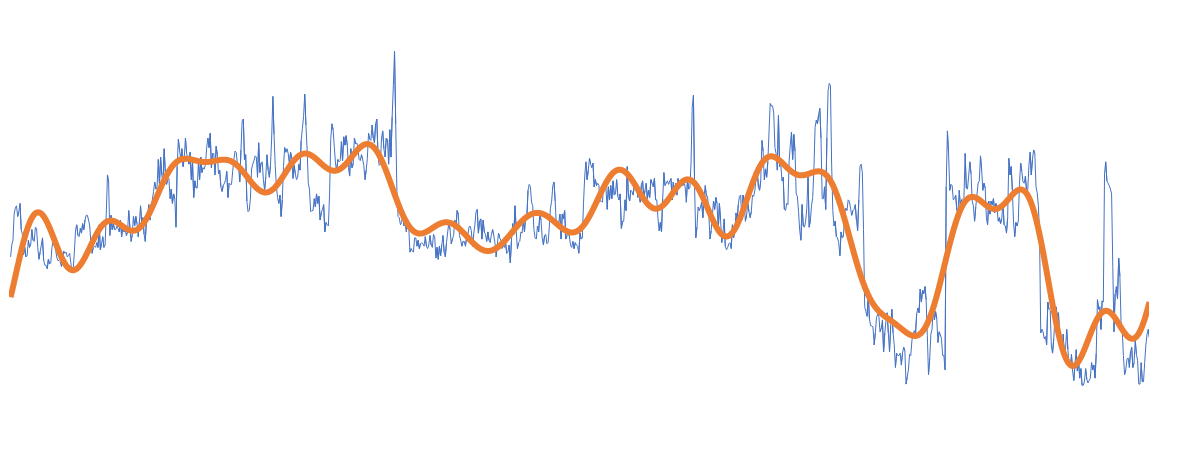
| Category | Original | Filtered |
|---|---|---|
| 0.0 | 149 | 115.1 |
| 1.0 | 159 | 119.304 |
| 2.0 | 163 | 123.616 |
| 3.0 | 185 | 128.004 |
| 4.0 | 190 | 132.438 |
| 5.0 | 192 | 136.883 |
| 6.0 | 183 | 141.306 |
| 7.0 | 187 | 145.676 |
| 8.0 | 194 | 149.959 |
| 9.0 | 172 | 154.123 |
| 10.0 | 168 | 158.138 |
| 11.0 | 151 | 161.975 |
| 12.0 | 157 | 165.606 |
| 13.0 | 149 | 169.006 |
| 14.0 | 150 | 172.15 |
| 15.0 | 163 | 175.02 |
| 16.0 | 157 | 177.595 |
| 17.0 | 159 | 179.862 |
| 18.0 | 172 | 181.807 |
| 19.0 | 163 | 183.422 |
| 20.0 | 162 | 184.7 |
| 21.0 | 174 | 185.638 |
| 22.0 | 173 | 186.238 |
| 23.0 | 157 | 186.502 |
| 24.0 | 147 | 186.437 |
| 25.0 | 153 | 186.053 |
| 26.0 | 159 | 185.363 |
| 27.0 | 165 | 184.382 |
| 28.0 | 146 | 183.129 |
| 29.0 | 142 | 181.624 |
| 30.0 | 142 | 179.889 |
| 31.0 | 139 | 177.949 |
| 32.0 | 147 | 175.83 |
| 33.0 | 143 | 173.56 |
| 34.0 | 144 | 171.166 |
| 35.0 | 157 | 168.679 |
| 36.0 | 162 | 166.128 |
| 37.0 | 165 | 163.543 |
| 38.0 | 156 | 160.953 |
| 39.0 | 149 | 158.387 |
| 40.0 | 146 | 155.874 |
| 41.0 | 146 | 153.44 |
| 42.0 | 145 | 151.111 |
| 43.0 | 141 | 148.912 |
| 44.0 | 146 | 146.865 |
| 45.0 | 154 | 144.99 |
| 46.0 | 152 | 143.305 |
| 47.0 | 153 | 141.825 |
| 48.0 | 149 | 140.565 |
| 49.0 | 150 | 139.533 |
| 50.0 | 152 | 138.739 |
| 51.0 | 144 | 138.186 |
| 52.0 | 136 | 137.878 |
| 53.0 | 139 | 137.814 |
| 54.0 | 153 | 137.991 |
| 55.0 | 172 | 138.403 |
| 56.0 | 176 | 139.042 |
| 57.0 | 167 | 139.899 |
| 58.0 | 166 | 140.959 |
| 59.0 | 173 | 142.209 |
| 60.0 | 169 | 143.632 |
| 61.0 | 177 | 145.211 |
| 62.0 | 172 | 146.925 |
| 63.0 | 180 | 148.755 |
| 64.0 | 184 | 150.68 |
| 65.0 | 184 | 152.677 |
| 66.0 | 180 | 154.725 |
| 67.0 | 175 | 156.801 |
| 68.0 | 160 | 158.884 |
| 69.0 | 152 | 160.953 |
| 70.0 | 157 | 162.985 |
| 71.0 | 158 | 164.963 |
| 72.0 | 157 | 166.867 |
| 73.0 | 161 | 168.679 |
| 74.0 | 157 | 170.386 |
| 75.0 | 176 | 171.971 |
| 76.0 | 155 | 173.424 |
| 77.0 | 160 | 174.733 |
| 78.0 | 166 | 175.893 |
| 79.0 | 157 | 176.895 |
| 80.0 | 159 | 177.737 |
| 81.0 | 185 | 178.416 |
| 82.0 | 218 | 178.935 |
| 83.0 | 211 | 179.294 |
| 84.0 | 167 | 179.5 |
| 85.0 | 184 | 179.558 |
| 86.0 | 172 | 179.478 |
| 87.0 | 177 | 179.271 |
| 88.0 | 172 | 178.947 |
| 89.0 | 172 | 178.521 |
| 90.0 | 175 | 178.006 |
| 91.0 | 173 | 177.42 |
| 92.0 | 170 | 176.778 |
| 93.0 | 180 | 176.098 |
| 94.0 | 166 | 175.397 |
| 95.0 | 176 | 174.693 |
| 96.0 | 170 | 174.005 |
| 97.0 | 172 | 173.349 |
| 98.0 | 167 | 172.742 |
| 99.0 | 170 | 172.202 |
| 100.0 | 188 | 171.743 |
| 101.0 | 173 | 171.381 |
| 102.0 | 162 | 171.129 |
| 103.0 | 168 | 170.998 |
| 104.0 | 183 | 171 |
| 105.0 | 175 | 171.144 |
| 106.0 | 183 | 171.436 |
| 107.0 | 177 | 171.883 |
| 108.0 | 166 | 172.488 |
| 109.0 | 178 | 173.253 |
| 110.0 | 192 | 174.179 |
| 111.0 | 177 | 175.264 |
| 112.0 | 182 | 176.503 |
| 113.0 | 168 | 177.893 |
| 114.0 | 162 | 179.426 |
| 115.0 | 180 | 181.094 |
| 116.0 | 184 | 182.887 |
| 117.0 | 193 | 184.794 |
| 118.0 | 180 | 186.803 |
| 119.0 | 188 | 188.9 |
| 120.0 | 197 | 191.072 |
| 121.0 | 204 | 193.304 |
| 122.0 | 212 | 195.58 |
| 123.0 | 206 | 197.886 |
| 124.0 | 208 | 200.205 |
| 125.0 | 231 | 202.522 |
| 126.0 | 210 | 204.822 |
| 127.0 | 233 | 207.089 |
| 128.0 | 218 | 209.31 |
| 129.0 | 211 | 211.471 |
| 130.0 | 240 | 213.559 |
| 131.0 | 220 | 215.562 |
| 132.0 | 210 | 217.471 |
| 133.0 | 214 | 219.275 |
| 134.0 | 215 | 220.966 |
| 135.0 | 198 | 222.539 |
| 136.0 | 206 | 223.987 |
| 137.0 | 194 | 225.307 |
| 138.0 | 202 | 226.497 |
| 139.0 | 198 | 227.555 |
| 140.0 | 174 | 228.483 |
| 141.0 | 225 | 229.282 |
| 142.0 | 248 | 229.955 |
| 143.0 | 239 | 230.507 |
| 144.0 | 231 | 230.944 |
| 145.0 | 240 | 231.272 |
| 146.0 | 225 | 231.498 |
| 147.0 | 232 | 231.632 |
| 148.0 | 249 | 231.682 |
| 149.0 | 236 | 231.658 |
| 150.0 | 232 | 231.57 |
| 151.0 | 227 | 231.428 |
| 152.0 | 237 | 231.242 |
| 153.0 | 214 | 231.022 |
| 154.0 | 229 | 230.779 |
| 155.0 | 199 | 230.522 |
| 156.0 | 213 | 230.26 |
| 157.0 | 207 | 230.002 |
| 158.0 | 207 | 229.756 |
| 159.0 | 229 | 229.529 |
| 160.0 | 214 | 229.326 |
| 161.0 | 233 | 229.153 |
| 162.0 | 220 | 229.014 |
| 163.0 | 224 | 228.913 |
| 164.0 | 223 | 228.85 |
| 165.0 | 227 | 228.827 |
| 166.0 | 241 | 228.843 |
| 167.0 | 249 | 228.898 |
| 168.0 | 241 | 228.987 |
| 169.0 | 253 | 229.109 |
| 170.0 | 224 | 229.259 |
| 171.0 | 236 | 229.43 |
| 172.0 | 236 | 229.618 |
| 173.0 | 218 | 229.815 |
| 174.0 | 242 | 230.015 |
| 175.0 | 235 | 230.209 |
| 176.0 | 219 | 230.39 |
| 177.0 | 222 | 230.549 |
| 178.0 | 208 | 230.679 |
| 179.0 | 204 | 230.77 |
| 180.0 | 209 | 230.816 |
| 181.0 | 211 | 230.809 |
| 182.0 | 214 | 230.742 |
| 183.0 | 221 | 230.609 |
| 184.0 | 199 | 230.403 |
| 185.0 | 211 | 230.121 |
| 186.0 | 210 | 229.757 |
| 187.0 | 210 | 229.311 |
| 188.0 | 221 | 228.779 |
| 189.0 | 231 | 228.161 |
| 190.0 | 238 | 227.458 |
| 191.0 | 237 | 226.672 |
| 192.0 | 227 | 225.804 |
| 193.0 | 225 | 224.86 |
| 194.0 | 212 | 223.845 |
| 195.0 | 239 | 222.765 |
| 196.0 | 263 | 221.627 |
| 197.0 | 265 | 220.441 |
| 198.0 | 231 | 219.214 |
| 199.0 | 235 | 217.958 |
| 200.0 | 196 | 216.684 |
| 201.0 | 187 | 215.402 |
| 202.0 | 188 | 214.125 |
| 203.0 | 198 | 212.864 |
| 204.0 | 223 | 211.633 |
| 205.0 | 227 | 210.443 |
| 206.0 | 230 | 209.307 |
| 207.0 | 234 | 208.237 |
| 208.0 | 233 | 207.243 |
| 209.0 | 216 | 206.338 |
| 210.0 | 245 | 205.531 |
| 211.0 | 220 | 204.833 |
| 212.0 | 228 | 204.25 |
| 213.0 | 229 | 203.791 |
| 214.0 | 214 | 203.462 |
| 215.0 | 205 | 203.268 |
| 216.0 | 216 | 203.213 |
| 217.0 | 235 | 203.298 |
| 218.0 | 222 | 203.525 |
| 219.0 | 216 | 203.893 |
| 220.0 | 226 | 204.401 |
| 221.0 | 249 | 205.044 |
| 222.0 | 284 | 205.817 |
| 223.0 | 252 | 206.715 |
| 224.0 | 226 | 207.73 |
| 225.0 | 208 | 208.853 |
| 226.0 | 199 | 210.074 |
| 227.0 | 194 | 211.382 |
| 228.0 | 201 | 212.765 |
| 229.0 | 183 | 214.21 |
| 230.0 | 197 | 215.704 |
| 231.0 | 225 | 217.234 |
| 232.0 | 241 | 218.784 |
| 233.0 | 237 | 220.34 |
| 234.0 | 240 | 221.888 |
| 235.0 | 236 | 223.414 |
| 236.0 | 227 | 224.903 |
| 237.0 | 237 | 226.342 |
| 238.0 | 232 | 227.718 |
| 239.0 | 215 | 229.019 |
| 240.0 | 226 | 230.232 |
| 241.0 | 219 | 231.349 |
| 242.0 | 214 | 232.359 |
| 243.0 | 216 | 233.254 |
| 244.0 | 227 | 234.029 |
| 245.0 | 222 | 234.678 |
| 246.0 | 247 | 235.197 |
| 247.0 | 257 | 235.583 |
| 248.0 | 267 | 235.837 |
| 249.0 | 286 | 235.958 |
| 250.0 | 260 | 235.95 |
| 251.0 | 240 | 235.816 |
| 252.0 | 211 | 235.561 |
| 253.0 | 206 | 235.192 |
| 254.0 | 187 | 234.718 |
| 255.0 | 188 | 234.147 |
| 256.0 | 188 | 233.49 |
| 257.0 | 198 | 232.757 |
| 258.0 | 191 | 231.962 |
| 259.0 | 202 | 231.117 |
| 260.0 | 194 | 230.236 |
| 261.0 | 200 | 229.331 |
| 262.0 | 180 | 228.418 |
| 263.0 | 186 | 227.511 |
| 264.0 | 189 | 226.623 |
| 265.0 | 193 | 225.768 |
| 266.0 | 170 | 224.96 |
| 267.0 | 178 | 224.211 |
| 268.0 | 176 | 223.532 |
| 269.0 | 175 | 222.936 |
| 270.0 | 201 | 222.432 |
| 271.0 | 248 | 222.029 |
| 272.0 | 261 | 221.734 |
| 273.0 | 256 | 221.553 |
| 274.0 | 242 | 221.492 |
| 275.0 | 228 | 221.554 |
| 276.0 | 221 | 221.739 |
| 277.0 | 231 | 222.049 |
| 278.0 | 229 | 222.481 |
| 279.0 | 230 | 223.033 |
| 280.0 | 246 | 223.7 |
| 281.0 | 230 | 224.475 |
| 282.0 | 250 | 225.351 |
| 283.0 | 243 | 226.319 |
| 284.0 | 251 | 227.368 |
| 285.0 | 243 | 228.486 |
| 286.0 | 224 | 229.662 |
| 287.0 | 217 | 230.881 |
| 288.0 | 240 | 232.128 |
| 289.0 | 224 | 233.389 |
| 290.0 | 227 | 234.648 |
| 291.0 | 249 | 235.889 |
| 292.0 | 244 | 237.096 |
| 293.0 | 245 | 238.253 |
| 294.0 | 241 | 239.344 |
| 295.0 | 231 | 240.353 |
| 296.0 | 230 | 241.266 |
| 297.0 | 235 | 242.067 |
| 298.0 | 231 | 242.745 |
| 299.0 | 226 | 243.285 |
| 300.0 | 214 | 243.677 |
| 301.0 | 222 | 243.91 |
| 302.0 | 232 | 243.975 |
| 303.0 | 253 | 243.866 |
| 304.0 | 248 | 243.577 |
| 305.0 | 247 | 243.102 |
| 306.0 | 260 | 242.439 |
| 307.0 | 249 | 241.588 |
| 308.0 | 245 | 240.549 |
| 309.0 | 261 | 239.324 |
| 310.0 | 265 | 237.918 |
| 311.0 | 235 | 236.335 |
| 312.0 | 226 | 234.584 |
| 313.0 | 227 | 232.673 |
| 314.0 | 249 | 230.611 |
| 315.0 | 255 | 228.41 |
| 316.0 | 240 | 226.083 |
| 317.0 | 233 | 223.644 |
| 318.0 | 249 | 221.106 |
| 319.0 | 248 | 218.485 |
| 320.0 | 227 | 215.798 |
| 321.0 | 256 | 213.059 |
| 322.0 | 233 | 210.287 |
| 323.0 | 267 | 207.498 |
| 324.0 | 293 | 204.709 |
| 325.0 | 322 | 201.937 |
| 326.0 | 261 | 199.197 |
| 327.0 | 204 | 196.507 |
| 328.0 | 183 | 193.881 |
| 329.0 | 182 | 191.334 |
| 330.0 | 176 | 188.88 |
| 331.0 | 178 | 186.532 |
| 332.0 | 185 | 184.3 |
| 333.0 | 175 | 182.195 |
| 334.0 | 176 | 180.228 |
| 335.0 | 170 | 178.404 |
| 336.0 | 181 | 176.731 |
| 337.0 | 176 | 175.214 |
| 338.0 | 153 | 173.855 |
| 339.0 | 156 | 172.658 |
| 340.0 | 154 | 171.622 |
| 341.0 | 153 | 170.747 |
| 342.0 | 165 | 170.03 |
| 343.0 | 165 | 169.467 |
| 344.0 | 158 | 169.054 |
| 345.0 | 163 | 168.785 |
| 346.0 | 156 | 168.651 |
| 347.0 | 160 | 168.645 |
| 348.0 | 161 | 168.757 |
| 349.0 | 160 | 168.977 |
| 350.0 | 158 | 169.294 |
| 351.0 | 166 | 169.696 |
| 352.0 | 158 | 170.172 |
| 353.0 | 156 | 170.709 |
| 354.0 | 159 | 171.295 |
| 355.0 | 167 | 171.917 |
| 356.0 | 159 | 172.562 |
| 357.0 | 157 | 173.219 |
| 358.0 | 168 | 173.874 |
| 359.0 | 166 | 174.516 |
| 360.0 | 148 | 175.135 |
| 361.0 | 157 | 175.719 |
| 362.0 | 147 | 176.258 |
| 363.0 | 158 | 176.743 |
| 364.0 | 150 | 177.167 |
| 365.0 | 159 | 177.521 |
| 366.0 | 167 | 177.799 |
| 367.0 | 153 | 177.997 |
| 368.0 | 149 | 178.108 |
| 369.0 | 161 | 178.131 |
| 370.0 | 170 | 178.063 |
| 371.0 | 178 | 177.902 |
| 372.0 | 172 | 177.649 |
| 373.0 | 160 | 177.305 |
| 374.0 | 164 | 176.871 |
| 375.0 | 167 | 176.35 |
| 376.0 | 180 | 175.745 |
| 377.0 | 173 | 175.063 |
| 378.0 | 188 | 174.307 |
| 379.0 | 185 | 173.484 |
| 380.0 | 167 | 172.6 |
| 381.0 | 163 | 171.664 |
| 382.0 | 158 | 170.682 |
| 383.0 | 162 | 169.662 |
| 384.0 | 162 | 168.614 |
| 385.0 | 158 | 167.546 |
| 386.0 | 165 | 166.465 |
| 387.0 | 167 | 165.383 |
| 388.0 | 174 | 164.306 |
| 389.0 | 175 | 163.245 |
| 390.0 | 171 | 162.206 |
| 391.0 | 158 | 161.2 |
| 392.0 | 168 | 160.233 |
| 393.0 | 176 | 159.313 |
| 394.0 | 187 | 158.448 |
| 395.0 | 189 | 157.643 |
| 396.0 | 169 | 156.906 |
| 397.0 | 179 | 156.241 |
| 398.0 | 181 | 155.654 |
| 399.0 | 164 | 155.149 |
| 400.0 | 180 | 154.73 |
| 401.0 | 170 | 154.4 |
| 402.0 | 168 | 154.16 |
| 403.0 | 162 | 154.013 |
| 404.0 | 170 | 153.96 |
| 405.0 | 163 | 154.002 |
| 406.0 | 161 | 154.137 |
| 407.0 | 168 | 154.365 |
| 408.0 | 172 | 154.685 |
| 409.0 | 167 | 155.094 |
| 410.0 | 161 | 155.59 |
| 411.0 | 149 | 156.17 |
| 412.0 | 159 | 156.829 |
| 413.0 | 169 | 157.564 |
| 414.0 | 165 | 158.371 |
| 415.0 | 163 | 159.244 |
| 416.0 | 156 | 160.178 |
| 417.0 | 158 | 161.167 |
| 418.0 | 157 | 162.206 |
| 419.0 | 161 | 163.289 |
| 420.0 | 152 | 164.408 |
| 421.0 | 153 | 165.558 |
| 422.0 | 159 | 166.732 |
| 423.0 | 144 | 167.923 |
| 424.0 | 163 | 169.125 |
| 425.0 | 177 | 170.331 |
| 426.0 | 168 | 171.533 |
| 427.0 | 192 | 172.726 |
| 428.0 | 171 | 173.902 |
| 429.0 | 156 | 175.056 |
| 430.0 | 161 | 176.18 |
| 431.0 | 162 | 177.269 |
| 432.0 | 170 | 178.316 |
| 433.0 | 169 | 179.316 |
| 434.0 | 181 | 180.264 |
| 435.0 | 170 | 181.154 |
| 436.0 | 184 | 181.982 |
| 437.0 | 182 | 182.742 |
| 438.0 | 205 | 183.431 |
| 439.0 | 210 | 184.046 |
| 440.0 | 208 | 184.583 |
| 441.0 | 195 | 185.039 |
| 442.0 | 192 | 185.412 |
| 443.0 | 172 | 185.701 |
| 444.0 | 165 | 185.903 |
| 445.0 | 164 | 186.02 |
| 446.0 | 175 | 186.05 |
| 447.0 | 170 | 185.994 |
| 448.0 | 185 | 185.853 |
| 449.0 | 180 | 185.629 |
| 450.0 | 165 | 185.325 |
| 451.0 | 159 | 184.943 |
| 452.0 | 167 | 184.487 |
| 453.0 | 168 | 183.961 |
| 454.0 | 160 | 183.371 |
| 455.0 | 161 | 182.722 |
| 456.0 | 174 | 182.02 |
| 457.0 | 190 | 181.271 |
| 458.0 | 196 | 180.483 |
| 459.0 | 209 | 179.663 |
| 460.0 | 212 | 178.819 |
| 461.0 | 196 | 177.961 |
| 462.0 | 175 | 177.096 |
| 463.0 | 178 | 176.234 |
| 464.0 | 178 | 175.385 |
| 465.0 | 185 | 174.558 |
| 466.0 | 164 | 173.762 |
| 467.0 | 185 | 173.007 |
| 468.0 | 181 | 172.304 |
| 469.0 | 188 | 171.66 |
| 470.0 | 164 | 171.087 |
| 471.0 | 167 | 170.592 |
| 472.0 | 172 | 170.184 |
| 473.0 | 166 | 169.872 |
| 474.0 | 159 | 169.662 |
| 475.0 | 157 | 169.562 |
| 476.0 | 162 | 169.579 |
| 477.0 | 156 | 169.716 |
| 478.0 | 161 | 169.98 |
| 479.0 | 159 | 170.374 |
| 480.0 | 158 | 170.899 |
| 481.0 | 152 | 171.559 |
| 482.0 | 169 | 172.353 |
| 483.0 | 164 | 173.282 |
| 484.0 | 165 | 174.342 |
| 485.0 | 195 | 175.532 |
| 486.0 | 217 | 176.847 |
| 487.0 | 229 | 178.282 |
| 488.0 | 214 | 179.831 |
| 489.0 | 222 | 181.486 |
| 490.0 | 232 | 183.24 |
| 491.0 | 227 | 185.081 |
| 492.0 | 224 | 187.001 |
| 493.0 | 228 | 188.987 |
| 494.0 | 208 | 191.027 |
| 495.0 | 214 | 193.109 |
| 496.0 | 209 | 195.218 |
| 497.0 | 211 | 197.342 |
| 498.0 | 209 | 199.465 |
| 499.0 | 196 | 201.573 |
| 500.0 | 196 | 203.65 |
| 501.0 | 195 | 205.684 |
| 502.0 | 211 | 207.658 |
| 503.0 | 206 | 209.558 |
| 504.0 | 207 | 211.371 |
| 505.0 | 189 | 213.083 |
| 506.0 | 208 | 214.682 |
| 507.0 | 197 | 216.155 |
| 508.0 | 209 | 217.491 |
| 509.0 | 198 | 218.682 |
| 510.0 | 213 | 219.717 |
| 511.0 | 201 | 220.59 |
| 512.0 | 202 | 221.295 |
| 513.0 | 214 | 221.827 |
| 514.0 | 200 | 222.183 |
| 515.0 | 197 | 222.361 |
| 516.0 | 202 | 222.361 |
| 517.0 | 173 | 222.186 |
| 518.0 | 179 | 221.837 |
| 519.0 | 179 | 221.32 |
| 520.0 | 197 | 220.642 |
| 521.0 | 188 | 219.809 |
| 522.0 | 225 | 218.832 |
| 523.0 | 199 | 217.721 |
| 524.0 | 196 | 216.488 |
| 525.0 | 205 | 215.146 |
| 526.0 | 204 | 213.71 |
| 527.0 | 201 | 212.193 |
| 528.0 | 210 | 210.613 |
| 529.0 | 206 | 208.985 |
| 530.0 | 206 | 207.327 |
| 531.0 | 199 | 205.655 |
| 532.0 | 204 | 203.988 |
| 533.0 | 195 | 202.342 |
| 534.0 | 210 | 200.734 |
| 535.0 | 213 | 199.181 |
| 536.0 | 198 | 197.699 |
| 537.0 | 205 | 196.303 |
| 538.0 | 211 | 195.007 |
| 539.0 | 198 | 193.825 |
| 540.0 | 205 | 192.769 |
| 541.0 | 199 | 191.848 |
| 542.0 | 214 | 191.073 |
| 543.0 | 211 | 190.451 |
| 544.0 | 208 | 189.987 |
| 545.0 | 215 | 189.686 |
| 546.0 | 197 | 189.549 |
| 547.0 | 197 | 189.578 |
| 548.0 | 181 | 189.771 |
| 549.0 | 171 | 190.125 |
| 550.0 | 178 | 190.633 |
| 551.0 | 170 | 191.29 |
| 552.0 | 198 | 192.087 |
| 553.0 | 220 | 193.013 |
| 554.0 | 209 | 194.057 |
| 555.0 | 211 | 195.204 |
| 556.0 | 213 | 196.441 |
| 557.0 | 210 | 197.751 |
| 558.0 | 213 | 199.118 |
| 559.0 | 215 | 200.525 |
| 560.0 | 197 | 201.952 |
| 561.0 | 212 | 203.382 |
| 562.0 | 202 | 204.795 |
| 563.0 | 211 | 206.173 |
| 564.0 | 201 | 207.497 |
| 565.0 | 215 | 208.748 |
| 566.0 | 207 | 209.91 |
| 567.0 | 208 | 210.964 |
| 568.0 | 214 | 211.896 |
| 569.0 | 209 | 212.689 |
| 570.0 | 212 | 213.332 |
| 571.0 | 208 | 213.812 |
| 572.0 | 195 | 214.119 |
| 573.0 | 214 | 214.245 |
| 574.0 | 206 | 214.182 |
| 575.0 | 207 | 213.927 |
| 576.0 | 228 | 213.477 |
| 577.0 | 275 | 212.831 |
| 578.0 | 285 | 211.991 |
| 579.0 | 208 | 210.961 |
| 580.0 | 165 | 209.747 |
| 581.0 | 174 | 208.357 |
| 582.0 | 191 | 206.801 |
| 583.0 | 188 | 205.091 |
| 584.0 | 191 | 203.241 |
| 585.0 | 195 | 201.265 |
| 586.0 | 182 | 199.181 |
| 587.0 | 200 | 197.008 |
| 588.0 | 209 | 194.764 |
| 589.0 | 200 | 192.47 |
| 590.0 | 200 | 190.148 |
| 591.0 | 187 | 187.819 |
| 592.0 | 164 | 185.506 |
| 593.0 | 171 | 183.23 |
| 594.0 | 183 | 181.014 |
| 595.0 | 196 | 178.881 |
| 596.0 | 189 | 176.851 |
| 597.0 | 199 | 174.944 |
| 598.0 | 194 | 173.181 |
| 599.0 | 170 | 171.58 |
| 600.0 | 194 | 170.158 |
| 601.0 | 180 | 168.93 |
| 602.0 | 161 | 167.91 |
| 603.0 | 169 | 167.11 |
| 604.0 | 181 | 166.539 |
| 605.0 | 158 | 166.206 |
| 606.0 | 155 | 166.117 |
| 607.0 | 157 | 166.273 |
| 608.0 | 160 | 166.678 |
| 609.0 | 161 | 167.328 |
| 610.0 | 156 | 168.221 |
| 611.0 | 176 | 169.352 |
| 612.0 | 165 | 170.712 |
| 613.0 | 170 | 172.291 |
| 614.0 | 186 | 174.077 |
| 615.0 | 180 | 176.057 |
| 616.0 | 193 | 178.215 |
| 617.0 | 200 | 180.533 |
| 618.0 | 201 | 182.994 |
| 619.0 | 180 | 185.578 |
| 620.0 | 201 | 188.264 |
| 621.0 | 195 | 191.031 |
| 622.0 | 179 | 193.857 |
| 623.0 | 184 | 196.72 |
| 624.0 | 195 | 199.597 |
| 625.0 | 187 | 202.466 |
| 626.0 | 182 | 205.306 |
| 627.0 | 187 | 208.095 |
| 628.0 | 201 | 210.813 |
| 629.0 | 200 | 213.44 |
| 630.0 | 205 | 215.959 |
| 631.0 | 215 | 218.353 |
| 632.0 | 222 | 220.605 |
| 633.0 | 208 | 222.704 |
| 634.0 | 205 | 224.636 |
| 635.0 | 213 | 226.392 |
| 636.0 | 247 | 227.965 |
| 637.0 | 238 | 229.347 |
| 638.0 | 214 | 230.536 |
| 639.0 | 223 | 231.529 |
| 640.0 | 216 | 232.326 |
| 641.0 | 229 | 232.931 |
| 642.0 | 254 | 233.347 |
| 643.0 | 278 | 233.581 |
| 644.0 | 276 | 233.639 |
| 645.0 | 276 | 233.533 |
| 646.0 | 270 | 233.272 |
| 647.0 | 241 | 232.87 |
| 648.0 | 236 | 232.339 |
| 649.0 | 222 | 231.694 |
| 650.0 | 268 | 230.951 |
| 651.0 | 225 | 230.126 |
| 652.0 | 226 | 229.235 |
| 653.0 | 213 | 228.294 |
| 654.0 | 216 | 227.32 |
| 655.0 | 189 | 226.329 |
| 656.0 | 188 | 225.337 |
| 657.0 | 194 | 224.359 |
| 658.0 | 193 | 223.409 |
| 659.0 | 229 | 222.501 |
| 660.0 | 243 | 221.647 |
| 661.0 | 254 | 220.857 |
| 662.0 | 231 | 220.141 |
| 663.0 | 252 | 219.507 |
| 664.0 | 238 | 218.96 |
| 665.0 | 202 | 218.506 |
| 666.0 | 200 | 218.146 |
| 667.0 | 187 | 217.882 |
| 668.0 | 171 | 217.712 |
| 669.0 | 163 | 217.634 |
| 670.0 | 193 | 217.642 |
| 671.0 | 175 | 217.732 |
| 672.0 | 174 | 217.895 |
| 673.0 | 179 | 218.121 |
| 674.0 | 190 | 218.399 |
| 675.0 | 217 | 218.718 |
| 676.0 | 174 | 219.065 |
| 677.0 | 180 | 219.425 |
| 678.0 | 192 | 219.783 |
| 679.0 | 199 | 220.124 |
| 680.0 | 223 | 220.431 |
| 681.0 | 258 | 220.69 |
| 682.0 | 264 | 220.884 |
| 683.0 | 261 | 220.997 |
| 684.0 | 269 | 221.013 |
| 685.0 | 274 | 220.919 |
| 686.0 | 249 | 220.699 |
| 687.0 | 198 | 220.34 |
| 688.0 | 198 | 219.832 |
| 689.0 | 208 | 219.162 |
| 690.0 | 189 | 218.323 |
| 691.0 | 249 | 217.305 |
| 692.0 | 289 | 216.103 |
| 693.0 | 295 | 214.713 |
| 694.0 | 293 | 213.132 |
| 695.0 | 227 | 211.358 |
| 696.0 | 188 | 209.394 |
| 697.0 | 175 | 207.241 |
| 698.0 | 179 | 204.905 |
| 699.0 | 166 | 202.391 |
| 700.0 | 165 | 199.708 |
| 701.0 | 161 | 196.866 |
| 702.0 | 150 | 193.875 |
| 703.0 | 170 | 190.747 |
| 704.0 | 165 | 187.498 |
| 705.0 | 166 | 184.14 |
| 706.0 | 186 | 180.69 |
| 707.0 | 190 | 177.165 |
| 708.0 | 188 | 173.581 |
| 709.0 | 197 | 169.956 |
| 710.0 | 196 | 166.307 |
| 711.0 | 190 | 162.651 |
| 712.0 | 184 | 159.006 |
| 713.0 | 188 | 155.389 |
| 714.0 | 189 | 151.816 |
| 715.0 | 193 | 148.302 |
| 716.0 | 180 | 144.863 |
| 717.0 | 171 | 141.512 |
| 718.0 | 197 | 138.261 |
| 719.0 | 225 | 135.121 |
| 720.0 | 227 | 132.103 |
| 721.0 | 220 | 129.214 |
| 722.0 | 172 | 126.462 |
| 723.0 | 107 | 123.851 |
| 724.0 | 103 | 121.385 |
| 725.0 | 99 | 119.066 |
| 726.0 | 117 | 116.894 |
| 727.0 | 97 | 114.869 |
| 728.0 | 91 | 112.986 |
| 729.0 | 91 | 111.243 |
| 730.0 | 90 | 109.634 |
| 731.0 | 75 | 108.152 |
| 732.0 | 85 | 106.789 |
| 733.0 | 98 | 105.538 |
| 734.0 | 101 | 104.388 |
| 735.0 | 99 | 103.33 |
| 736.0 | 86 | 102.353 |
| 737.0 | 89 | 101.447 |
| 738.0 | 96 | 100.6 |
| 739.0 | 69 | 99.803 |
| 740.0 | 85 | 99.044 |
| 741.0 | 95 | 98.315 |
| 742.0 | 102 | 97.604 |
| 743.0 | 85 | 96.905 |
| 744.0 | 69 | 96.209 |
| 745.0 | 91 | 95.51 |
| 746.0 | 105 | 94.802 |
| 747.0 | 85 | 94.081 |
| 748.0 | 75 | 93.345 |
| 749.0 | 56 | 92.592 |
| 750.0 | 68 | 91.821 |
| 751.0 | 66 | 91.036 |
| 752.0 | 66 | 90.238 |
| 753.0 | 68 | 89.433 |
| 754.0 | 58 | 88.626 |
| 755.0 | 68 | 87.824 |
| 756.0 | 73 | 87.037 |
| 757.0 | 70 | 86.274 |
| 758.0 | 42 | 85.546 |
| 759.0 | 48 | 84.865 |
| 760.0 | 54 | 84.244 |
| 761.0 | 67 | 83.696 |
| 762.0 | 66 | 83.234 |
| 763.0 | 79 | 82.873 |
| 764.0 | 84 | 82.627 |
| 765.0 | 87 | 82.509 |
| 766.0 | 84 | 82.534 |
| 767.0 | 101 | 82.714 |
| 768.0 | 106 | 83.062 |
| 769.0 | 102 | 83.588 |
| 770.0 | 122 | 84.305 |
| 771.0 | 111 | 85.22 |
| 772.0 | 121 | 86.342 |
| 773.0 | 118 | 87.676 |
| 774.0 | 124 | 89.228 |
| 775.0 | 113 | 90.999 |
| 776.0 | 83 | 92.99 |
| 777.0 | 50 | 95.201 |
| 778.0 | 63 | 97.627 |
| 779.0 | 84 | 100.265 |
| 780.0 | 88 | 103.106 |
| 781.0 | 107 | 106.141 |
| 782.0 | 96 | 109.359 |
| 783.0 | 103 | 112.748 |
| 784.0 | 97 | 116.291 |
| 785.0 | 77 | 119.974 |
| 786.0 | 86 | 123.777 |
| 787.0 | 84 | 127.681 |
| 788.0 | 80 | 131.667 |
| 789.0 | 66 | 135.712 |
| 790.0 | 66 | 139.794 |
| 791.0 | 54 | 143.891 |
| 792.0 | 208 | 147.979 |
| 793.0 | 255 | 152.036 |
| 794.0 | 236 | 156.037 |
| 795.0 | 205 | 159.961 |
| 796.0 | 210 | 163.786 |
| 797.0 | 209 | 167.491 |
| 798.0 | 197 | 171.055 |
| 799.0 | 198 | 174.46 |
| 800.0 | 201 | 177.688 |
| 801.0 | 188 | 180.725 |
| 802.0 | 188 | 183.556 |
| 803.0 | 205 | 186.17 |
| 804.0 | 191 | 188.558 |
| 805.0 | 197 | 190.712 |
| 806.0 | 198 | 192.627 |
| 807.0 | 199 | 194.3 |
| 808.0 | 236 | 195.732 |
| 809.0 | 207 | 196.925 |
| 810.0 | 206 | 197.883 |
| 811.0 | 217 | 198.613 |
| 812.0 | 229 | 199.124 |
| 813.0 | 219 | 199.428 |
| 814.0 | 196 | 199.536 |
| 815.0 | 192 | 199.465 |
| 816.0 | 179 | 199.231 |
| 817.0 | 191 | 198.851 |
| 818.0 | 201 | 198.345 |
| 819.0 | 211 | 197.732 |
| 820.0 | 213 | 197.034 |
| 821.0 | 234 | 196.272 |
| 822.0 | 222 | 195.467 |
| 823.0 | 205 | 194.64 |
| 824.0 | 211 | 193.813 |
| 825.0 | 207 | 193.005 |
| 826.0 | 182 | 192.237 |
| 827.0 | 176 | 191.526 |
| 828.0 | 196 | 190.889 |
| 829.0 | 185 | 190.342 |
| 830.0 | 196 | 189.898 |
| 831.0 | 193 | 189.569 |
| 832.0 | 198 | 189.364 |
| 833.0 | 186 | 189.291 |
| 834.0 | 194 | 189.354 |
| 835.0 | 191 | 189.555 |
| 836.0 | 179 | 189.894 |
| 837.0 | 182 | 190.368 |
| 838.0 | 177 | 190.972 |
| 839.0 | 181 | 191.698 |
| 840.0 | 195 | 192.535 |
| 841.0 | 176 | 193.471 |
| 842.0 | 175 | 194.49 |
| 843.0 | 169 | 195.576 |
| 844.0 | 182 | 196.709 |
| 845.0 | 232 | 197.869 |
| 846.0 | 218 | 199.035 |
| 847.0 | 225 | 200.181 |
| 848.0 | 205 | 201.285 |
| 849.0 | 178 | 202.321 |
| 850.0 | 166 | 203.264 |
| 851.0 | 178 | 204.089 |
| 852.0 | 175 | 204.77 |
| 853.0 | 179 | 205.284 |
| 854.0 | 210 | 205.605 |
| 855.0 | 228 | 205.712 |
| 856.0 | 221 | 205.584 |
| 857.0 | 212 | 205.201 |
| 858.0 | 211 | 204.545 |
| 859.0 | 217 | 203.601 |
| 860.0 | 205 | 202.357 |
| 861.0 | 205 | 200.801 |
| 862.0 | 226 | 198.928 |
| 863.0 | 237 | 196.731 |
| 864.0 | 218 | 194.21 |
| 865.0 | 231 | 191.365 |
| 866.0 | 239 | 188.203 |
| 867.0 | 236 | 184.73 |
| 868.0 | 208 | 180.957 |
| 869.0 | 203 | 176.899 |
| 870.0 | 192 | 172.573 |
| 871.0 | 170 | 167.997 |
| 872.0 | 85 | 163.196 |
| 873.0 | 88 | 158.193 |
| 874.0 | 86 | 153.016 |
| 875.0 | 80 | 147.694 |
| 876.0 | 82 | 142.258 |
| 877.0 | 75 | 136.74 |
| 878.0 | 111 | 131.174 |
| 879.0 | 105 | 125.594 |
| 880.0 | 104 | 120.035 |
| 881.0 | 74 | 114.533 |
| 882.0 | 68 | 109.12 |
| 883.0 | 80 | 103.833 |
| 884.0 | 97 | 98.704 |
| 885.0 | 107 | 93.764 |
| 886.0 | 99 | 89.046 |
| 887.0 | 102 | 84.577 |
| 888.0 | 83 | 80.383 |
| 889.0 | 73 | 76.49 |
| 890.0 | 71 | 72.917 |
| 891.0 | 84 | 69.684 |
| 892.0 | 65 | 66.807 |
| 893.0 | 72 | 64.297 |
| 894.0 | 88 | 62.164 |
| 895.0 | 71 | 60.412 |
| 896.0 | 58 | 59.045 |
| 897.0 | 57 | 58.06 |
| 898.0 | 67 | 57.453 |
| 899.0 | 53 | 57.215 |
| 900.0 | 45 | 57.335 |
| 901.0 | 59 | 57.798 |
| 902.0 | 71 | 58.586 |
| 903.0 | 53 | 59.679 |
| 904.0 | 62 | 61.054 |
| 905.0 | 47 | 62.685 |
| 906.0 | 55 | 64.545 |
| 907.0 | 41 | 66.604 |
| 908.0 | 41 | 68.832 |
| 909.0 | 44 | 71.197 |
| 910.0 | 55 | 73.667 |
| 911.0 | 46 | 76.21 |
| 912.0 | 43 | 78.791 |
| 913.0 | 45 | 81.379 |
| 914.0 | 47 | 83.941 |
| 915.0 | 60 | 86.448 |
| 916.0 | 54 | 88.869 |
| 917.0 | 58 | 91.177 |
| 918.0 | 47 | 93.346 |
| 919.0 | 68 | 95.353 |
| 920.0 | 113 | 97.176 |
| 921.0 | 105 | 98.796 |
| 922.0 | 107 | 100.2 |
| 923.0 | 88 | 101.374 |
| 924.0 | 112 | 102.309 |
| 925.0 | 111 | 102.998 |
| 926.0 | 219 | 103.441 |
| 927.0 | 229 | 103.636 |
| 928.0 | 213 | 103.589 |
| 929.0 | 211 | 103.307 |
| 930.0 | 209 | 102.799 |
| 931.0 | 206 | 102.08 |
| 932.0 | 202 | 101.166 |
| 933.0 | 141 | 100.075 |
| 934.0 | 86 | 98.83 |
| 935.0 | 118 | 97.454 |
| 936.0 | 124 | 95.972 |
| 937.0 | 114 | 94.411 |
| 938.0 | 148 | 92.8 |
| 939.0 | 133 | 91.169 |
| 940.0 | 93 | 89.546 |
| 941.0 | 87 | 87.963 |
| 942.0 | 66 | 86.449 |
| 943.0 | 50 | 85.034 |
| 944.0 | 54 | 83.747 |
| 945.0 | 63 | 82.616 |
| 946.0 | 64 | 81.668 |
| 947.0 | 56 | 80.926 |
| 948.0 | 69 | 80.414 |
| 949.0 | 73 | 80.151 |
| 950.0 | 56 | 80.156 |
| 951.0 | 60 | 80.443 |
| 952.0 | 79 | 81.025 |
| 953.0 | 67 | 81.911 |
| 954.0 | 62 | 83.106 |
| 955.0 | 42 | 84.613 |
| 956.0 | 42 | 86.432 |
| 957.0 | 60 | 88.557 |
| 958.0 | 44 | 90.983 |
| 959.0 | 44 | 93.698 |
| 960.0 | 60 | 96.688 |
| 961.0 | 75 | 99.938 |
| 962.0 | 84 | 103.427 |
| 963.0 | 88 | 107.134 |
| 964.0 | 81 | 111.033 |